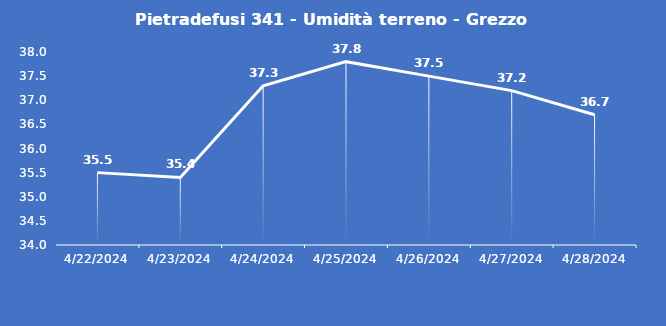
| Category | Pietradefusi 341 - Umidità terreno - Grezzo (%VWC) |
|---|---|
| 4/22/24 | 35.5 |
| 4/23/24 | 35.4 |
| 4/24/24 | 37.3 |
| 4/25/24 | 37.8 |
| 4/26/24 | 37.5 |
| 4/27/24 | 37.2 |
| 4/28/24 | 36.7 |